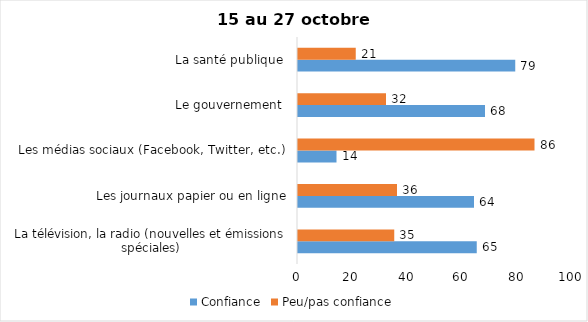
| Category | Confiance | Peu/pas confiance |
|---|---|---|
| La télévision, la radio (nouvelles et émissions spéciales) | 65 | 35 |
| Les journaux papier ou en ligne | 64 | 36 |
| Les médias sociaux (Facebook, Twitter, etc.) | 14 | 86 |
| Le gouvernement  | 68 | 32 |
| La santé publique  | 79 | 21 |